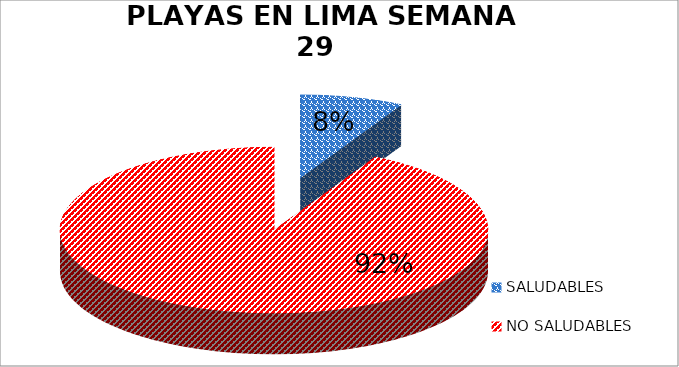
| Category | N.° |
|---|---|
| SALUDABLES | 5 |
| NO SALUDABLES | 59 |